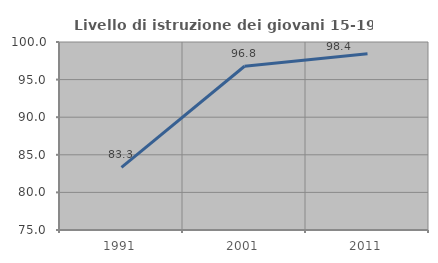
| Category | Livello di istruzione dei giovani 15-19 anni |
|---|---|
| 1991.0 | 83.333 |
| 2001.0 | 96.774 |
| 2011.0 | 98.429 |